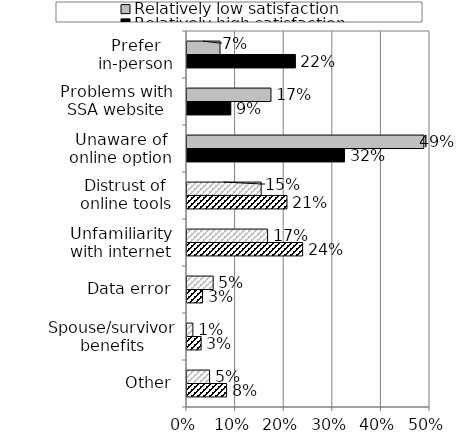
| Category | Relatively high satisfaction | Relatively low satisfaction |
|---|---|---|
| Other | 0.081 | 0.046 |
| Spouse/survivor benefits | 0.029 | 0.012 |
| Data error | 0.032 | 0.054 |
| Unfamiliarity with internet | 0.238 | 0.166 |
| Distrust of online tools | 0.206 | 0.153 |
| Unaware of online option | 0.324 | 0.487 |
| Problems with SSA website | 0.09 | 0.173 |
| Prefer in-person | 0.223 | 0.068 |